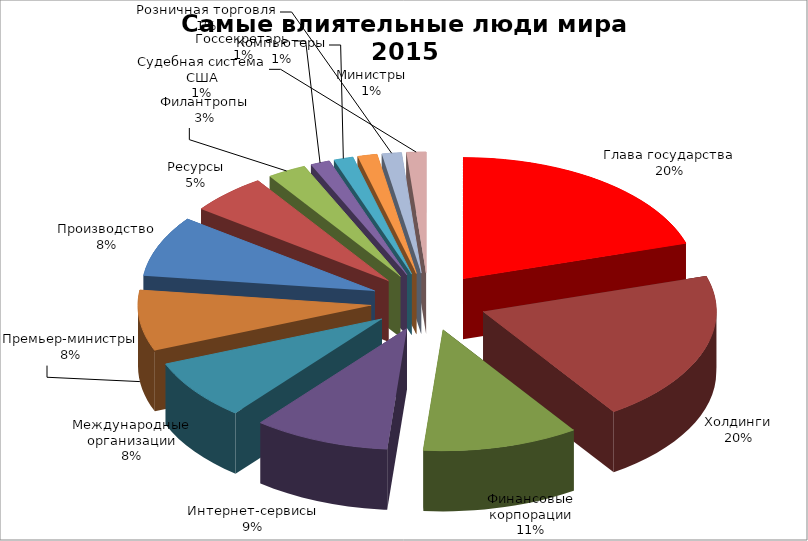
| Category | Series 0 |
|---|---|
| Глава государства | 15 |
| Холдинги | 15 |
| Финансовые корпорации | 8 |
| Интернет-сервисы | 7 |
| Международные организации | 6 |
| Премьер-министры | 6 |
| Производство | 6 |
| Ресурсы | 4 |
| Филантропы | 2 |
| Госсекретарь | 1 |
| Компьютеры | 1 |
| Министры | 1 |
| Розничная торговля | 1 |
| Судебная система США | 1 |